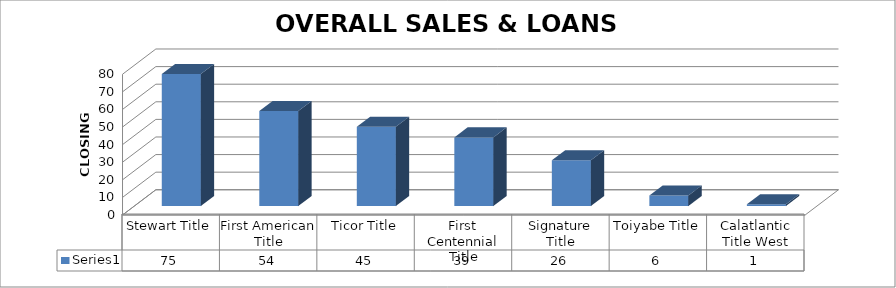
| Category | Series 0 |
|---|---|
| Stewart Title | 75 |
| First American Title | 54 |
| Ticor Title | 45 |
| First Centennial Title | 39 |
| Signature Title | 26 |
| Toiyabe Title | 6 |
| Calatlantic Title West | 1 |